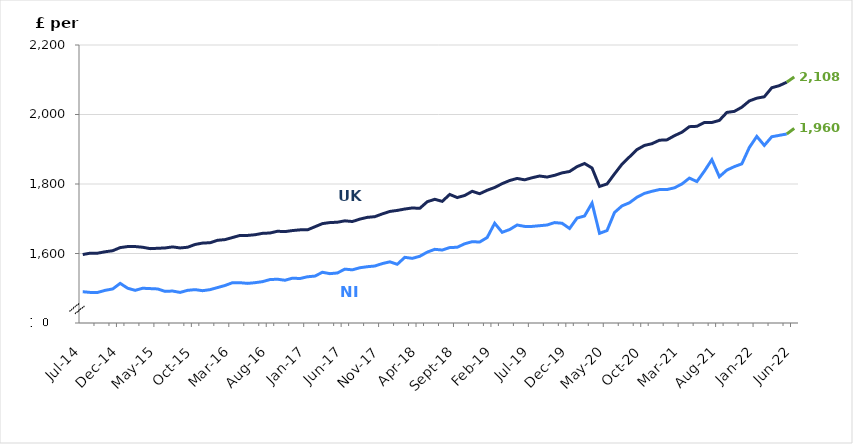
| Category | Series 0 | Series 1 |
|---|---|---|
| 2014-07-01 | 1490 | 1597 |
| 2014-08-01 | 1488 | 1601 |
| 2014-09-01 | 1488 | 1601 |
| 2014-10-01 | 1494 | 1605 |
| 2014-11-01 | 1498 | 1608 |
| 2014-12-01 | 1514 | 1617 |
| 2015-01-01 | 1500 | 1620 |
| 2015-02-01 | 1494 | 1620 |
| 2015-03-01 | 1500 | 1618 |
| 2015-04-01 | 1499 | 1614 |
| 2015-05-01 | 1498 | 1615 |
| 2015-06-01 | 1491 | 1616 |
| 2015-07-01 | 1492 | 1619 |
| 2015-08-01 | 1488 | 1616 |
| 2015-09-01 | 1494 | 1618 |
| 2015-10-01 | 1496 | 1626 |
| 2015-11-01 | 1493 | 1630 |
| 2015-12-01 | 1496 | 1631 |
| 2016-01-01 | 1502 | 1638 |
| 2016-02-01 | 1508 | 1640 |
| 2016-03-01 | 1516 | 1646 |
| 2016-04-01 | 1516 | 1652 |
| 2016-05-01 | 1514 | 1652 |
| 2016-06-01 | 1516 | 1654 |
| 2016-07-01 | 1519 | 1658 |
| 2016-08-01 | 1525 | 1659 |
| 2016-09-01 | 1526 | 1664 |
| 2016-10-01 | 1523 | 1663 |
| 2016-11-01 | 1529 | 1666 |
| 2016-12-01 | 1528 | 1668 |
| 2017-01-01 | 1533 | 1668 |
| 2017-02-01 | 1535 | 1677 |
| 2017-03-01 | 1546 | 1686 |
| 2017-04-01 | 1542 | 1689 |
| 2017-05-01 | 1544 | 1690 |
| 2017-06-01 | 1555 | 1694 |
| 2017-07-01 | 1553 | 1692 |
| 2017-08-01 | 1559 | 1699 |
| 2017-09-01 | 1562 | 1704 |
| 2017-10-01 | 1564 | 1706 |
| 2017-11-01 | 1571 | 1714 |
| 2017-12-01 | 1576 | 1721 |
| 2018-01-01 | 1569 | 1724 |
| 2018-02-01 | 1589 | 1728 |
| 2018-03-01 | 1586 | 1731 |
| 2018-04-01 | 1592 | 1730 |
| 2018-05-01 | 1604 | 1749 |
| 2018-06-01 | 1612 | 1756 |
| 2018-07-01 | 1610 | 1750 |
| 2018-08-01 | 1617 | 1770 |
| 2018-09-01 | 1618 | 1761 |
| 2018-10-01 | 1628 | 1767 |
| 2018-11-01 | 1634 | 1779 |
| 2018-12-01 | 1633 | 1772 |
| 2019-01-01 | 1646 | 1782 |
| 2019-02-01 | 1687 | 1790 |
| 2019-03-01 | 1661 | 1801 |
| 2019-04-01 | 1669 | 1810 |
| 2019-05-01 | 1682 | 1816 |
| 2019-06-01 | 1678 | 1812 |
| 2019-07-01 | 1678 | 1818 |
| 2019-08-01 | 1680 | 1823 |
| 2019-09-01 | 1682 | 1820 |
| 2019-10-01 | 1689 | 1825 |
| 2019-11-01 | 1687 | 1832 |
| 2019-12-01 | 1672 | 1836 |
| 2020-01-01 | 1702 | 1850 |
| 2020-02-01 | 1708 | 1859 |
| 2020-03-01 | 1745 | 1846 |
| 2020-04-01 | 1658 | 1793 |
| 2020-05-01 | 1666 | 1800 |
| 2020-06-01 | 1718 | 1829 |
| 2020-07-01 | 1737 | 1857 |
| 2020-08-01 | 1746 | 1878 |
| 2020-09-01 | 1762 | 1899 |
| 2020-10-01 | 1773 | 1911 |
| 2020-11-01 | 1779 | 1916 |
| 2020-12-01 | 1784 | 1926 |
| 2021-01-01 | 1784 | 1927 |
| 2021-02-01 | 1789 | 1939 |
| 2021-03-01 | 1800 | 1949 |
| 2021-04-01 | 1817 | 1965 |
| 2021-05-01 | 1807 | 1966 |
| 2021-06-01 | 1837 | 1977 |
| 2021-07-01 | 1870 | 1977 |
| 2021-08-01 | 1821 | 1983 |
| 2021-09-01 | 1840 | 2006 |
| 2021-10-01 | 1850 | 2009 |
| 2021-11-01 | 1858 | 2021 |
| 2021-12-01 | 1905 | 2039 |
| 2022-01-01 | 1937 | 2047 |
| 2022-02-01 | 1911 | 2051 |
| 2022-03-01 | 1936 | 2077 |
| 2022-04-01 | 1940 | 2083 |
| 2022-05-01 | 1944 | 2093 |
| 2022-06-01 | 1960 | 2108 |